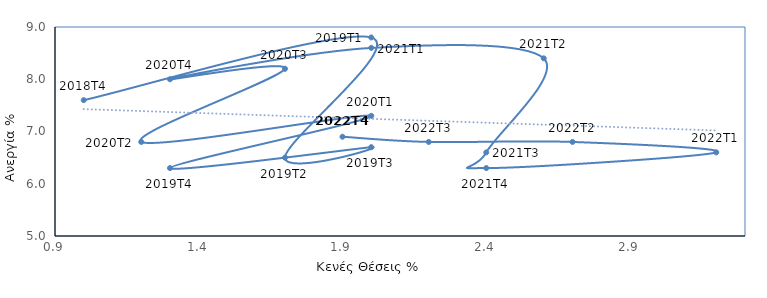
| Category | Ποσοστό κενών θέσεων & Ανεργίας |
|---|---|
| 1.0 | 7.6 |
| 2.0 | 8.8 |
| 1.7 | 6.5 |
| 2.0 | 6.7 |
| 1.3 | 6.3 |
| 2.0 | 7.3 |
| 1.2 | 6.8 |
| 1.7 | 8.2 |
| 1.3 | 8 |
| 2.0 | 8.6 |
| 2.6 | 8.4 |
| 2.4 | 6.6 |
| 2.4 | 6.3 |
| 3.2 | 6.6 |
| 2.7 | 6.8 |
| 2.2 | 6.8 |
| 1.9 | 6.9 |